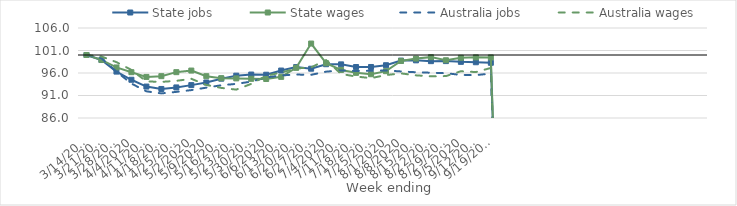
| Category | State jobs | State wages | Australia jobs | Australia wages |
|---|---|---|---|---|
| 14/03/2020 | 100 | 100 | 100 | 100 |
| 21/03/2020 | 98.885 | 98.912 | 99.278 | 99.672 |
| 28/03/2020 | 96.312 | 97.235 | 96.309 | 98.416 |
| 04/04/2020 | 94.499 | 96.178 | 93.652 | 96.688 |
| 11/04/2020 | 92.985 | 95.128 | 91.928 | 94.131 |
| 18/04/2020 | 92.452 | 95.299 | 91.47 | 94.024 |
| 25/04/2020 | 92.792 | 96.187 | 91.802 | 94.259 |
| 02/05/2020 | 93.306 | 96.545 | 92.199 | 94.709 |
| 09/05/2020 | 93.89 | 95.289 | 92.746 | 93.35 |
| 16/05/2020 | 94.738 | 94.845 | 93.278 | 92.689 |
| 23/05/2020 | 95.406 | 94.803 | 93.582 | 92.309 |
| 30/05/2020 | 95.66 | 94.709 | 94.088 | 93.584 |
| 06/06/2020 | 95.617 | 94.669 | 95.005 | 95.392 |
| 13/06/2020 | 96.546 | 95.142 | 95.464 | 96.09 |
| 20/06/2020 | 97.314 | 97.144 | 95.655 | 97.004 |
| 27/06/2020 | 96.955 | 102.547 | 95.595 | 97.247 |
| 04/07/2020 | 97.953 | 98.172 | 96.297 | 98.874 |
| 11/07/2020 | 97.92 | 96.679 | 96.584 | 95.79 |
| 18/07/2020 | 97.327 | 96.033 | 96.449 | 95.216 |
| 25/07/2020 | 97.336 | 95.726 | 96.501 | 94.86 |
| 01/08/2020 | 97.729 | 96.405 | 96.569 | 95.541 |
| 08/08/2020 | 98.751 | 98.684 | 96.344 | 95.915 |
| 15/08/2020 | 98.814 | 99.205 | 96.168 | 95.478 |
| 22/08/2020 | 98.634 | 99.526 | 96.063 | 95.259 |
| 29/08/2020 | 98.645 | 98.833 | 95.951 | 95.312 |
| 05/09/2020 | 98.476 | 99.389 | 95.576 | 96.393 |
| 12/09/2020 | 98.391 | 99.478 | 95.53 | 96.207 |
| 19/09/2020 | 98.269 | 99.467 | 95.881 | 97.123 |